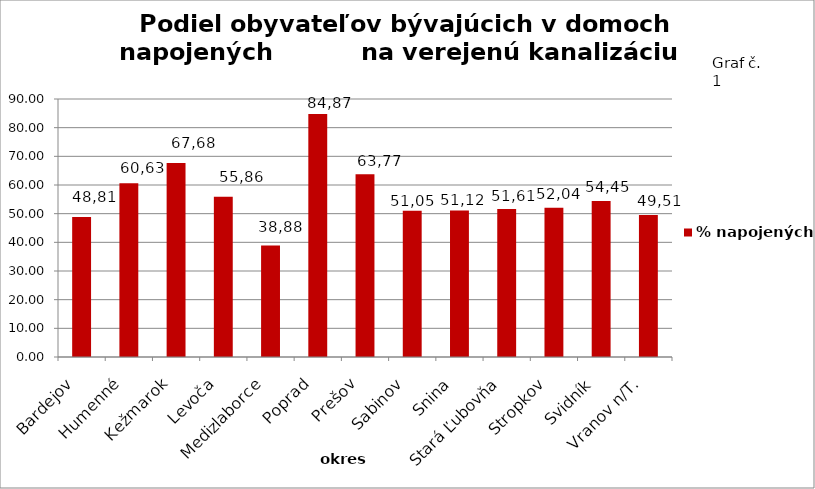
| Category | % napojených  |
|---|---|
| Bardejov  | 48.812 |
| Humenné  | 60.634 |
| Kežmarok  | 67.679 |
| Levoča  | 55.859 |
| Medizlaborce  | 38.878 |
| Poprad  | 84.765 |
| Prešov  | 63.765 |
| Sabinov  | 51.055 |
| Snina  | 51.12 |
| Stará Ľubovňa  | 51.614 |
| Stropkov  | 52.041 |
| Svidník  | 54.454 |
| Vranov n/T.  | 49.506 |